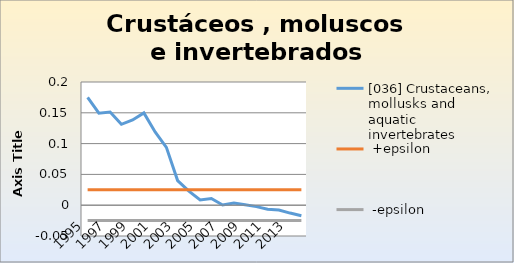
| Category | [036] Crustaceans, mollusks and aquatic invertebrates |  +epsilon |  -epsilon |
|---|---|---|---|
| 1995.0 | 0.175 | 0.025 | -0.025 |
| 1996.0 | 0.149 | 0.025 | -0.025 |
| 1997.0 | 0.151 | 0.025 | -0.025 |
| 1998.0 | 0.131 | 0.025 | -0.025 |
| 1999.0 | 0.138 | 0.025 | -0.025 |
| 2000.0 | 0.15 | 0.025 | -0.025 |
| 2001.0 | 0.119 | 0.025 | -0.025 |
| 2002.0 | 0.094 | 0.025 | -0.025 |
| 2003.0 | 0.04 | 0.025 | -0.025 |
| 2004.0 | 0.023 | 0.025 | -0.025 |
| 2005.0 | 0.009 | 0.025 | -0.025 |
| 2006.0 | 0.011 | 0.025 | -0.025 |
| 2007.0 | 0 | 0.025 | -0.025 |
| 2008.0 | 0.004 | 0.025 | -0.025 |
| 2009.0 | 0.001 | 0.025 | -0.025 |
| 2010.0 | -0.002 | 0.025 | -0.025 |
| 2011.0 | -0.007 | 0.025 | -0.025 |
| 2012.0 | -0.008 | 0.025 | -0.025 |
| 2013.0 | -0.013 | 0.025 | -0.025 |
| 2014.0 | -0.017 | 0.025 | -0.025 |